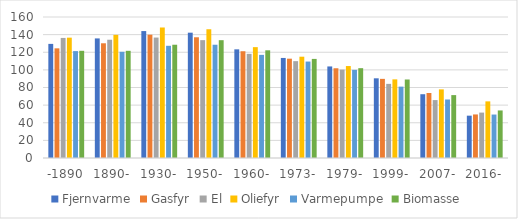
| Category | Fjernvarme | Gasfyr | El | Oliefyr | Varmepumpe | Biomasse |
|---|---|---|---|---|---|---|
| -1890 | 129.491 | 124.436 | 136.244 | 136.555 | 121.303 | 121.648 |
| 1890- | 135.703 | 130.182 | 134.198 | 139.733 | 120.536 | 121.631 |
| 1930- | 144.037 | 139.917 | 136.672 | 147.985 | 127.33 | 128.528 |
| 1950- | 142.209 | 136.993 | 133.739 | 146.127 | 128.528 | 133.69 |
| 1960- | 123.303 | 121.145 | 118.194 | 125.796 | 117.035 | 122.206 |
| 1973- | 113.531 | 112.694 | 109.904 | 114.953 | 109.444 | 112.439 |
| 1979- | 103.89 | 101.841 | 100.301 | 104.349 | 100.009 | 101.929 |
| 1999- | 90.427 | 89.802 | 84.121 | 89.234 | 80.995 | 89.086 |
| 2007- | 72.377 | 73.756 | 65.729 | 77.878 | 66.394 | 71.371 |
| 2016- | 48.036 | 49.427 | 51.527 | 64.261 | 49.317 | 53.962 |